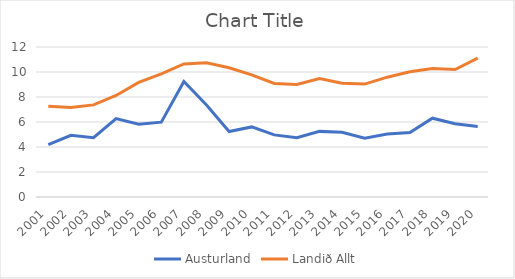
| Category | Austurland | Landið Allt |
|---|---|---|
| 2001.0 | 4.183 | 7.254 |
| 2002.0 | 4.936 | 7.168 |
| 2003.0 | 4.743 | 7.37 |
| 2004.0 | 6.27 | 8.122 |
| 2005.0 | 5.822 | 9.171 |
| 2006.0 | 5.987 | 9.851 |
| 2007.0 | 9.246 | 10.641 |
| 2008.0 | 7.357 | 10.741 |
| 2009.0 | 5.24 | 10.341 |
| 2010.0 | 5.607 | 9.768 |
| 2011.0 | 4.968 | 9.089 |
| 2012.0 | 4.742 | 9.006 |
| 2013.0 | 5.249 | 9.473 |
| 2014.0 | 5.172 | 9.093 |
| 2015.0 | 4.702 | 9.031 |
| 2016.0 | 5.032 | 9.586 |
| 2017.0 | 5.165 | 10.012 |
| 2018.0 | 6.302 | 10.283 |
| 2019.0 | 5.866 | 10.194 |
| 2020.0 | 5.647 | 11.112 |